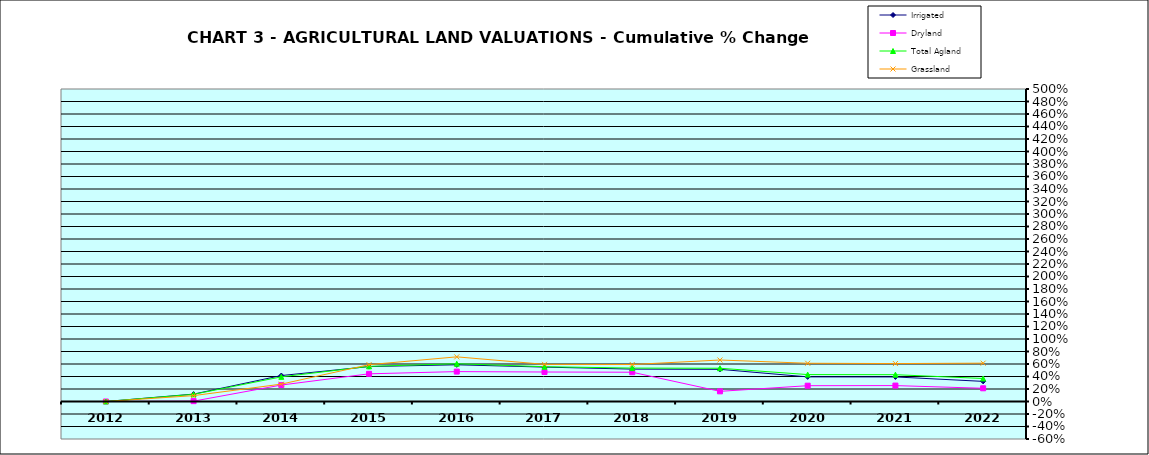
| Category | Irrigated | Dryland | Total Agland | Grassland |
|---|---|---|---|---|
| 2012.0 | 0 | 0 | 0 | 0 |
| 2013.0 | 0.118 | 0.006 | 0.115 | 0.094 |
| 2014.0 | 0.415 | 0.263 | 0.394 | 0.278 |
| 2015.0 | 0.559 | 0.443 | 0.562 | 0.589 |
| 2016.0 | 0.587 | 0.478 | 0.604 | 0.714 |
| 2017.0 | 0.55 | 0.472 | 0.557 | 0.594 |
| 2018.0 | 0.518 | 0.468 | 0.535 | 0.592 |
| 2019.0 | 0.515 | 0.163 | 0.532 | 0.664 |
| 2020.0 | 0.394 | 0.253 | 0.431 | 0.612 |
| 2021.0 | 0.393 | 0.255 | 0.429 | 0.607 |
| 2022.0 | 0.322 | 0.211 | 0.368 | 0.613 |